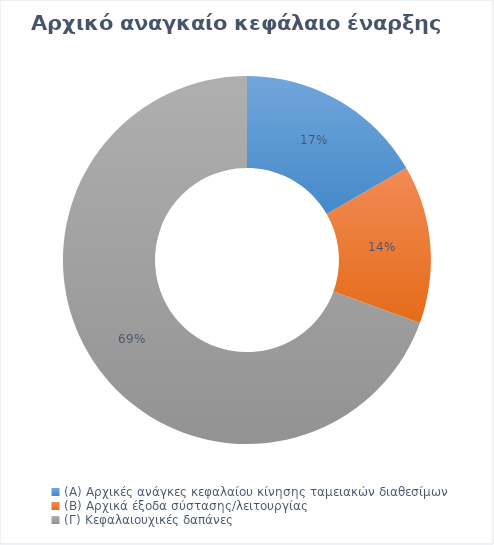
| Category | Series 0 |
|---|---|
| (Α) Αρχικές ανάγκες κεφαλαίου κίνησης ταμειακών διαθεσίμων | 1200 |
| (Β) Αρχικά έξοδα σύστασης/λειτουργίας | 1000 |
| (Γ) Κεφαλαιουχικές δαπάνες | 5000 |